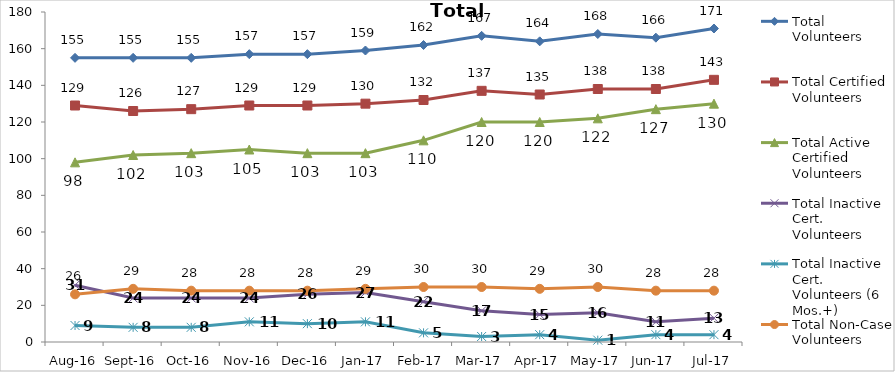
| Category | Total Volunteers | Total Certified Volunteers | Total Active Certified Volunteers | Total Inactive Cert. Volunteers | Total Inactive Cert. Volunteers (6 Mos.+) | Total Non-Case Volunteers |
|---|---|---|---|---|---|---|
| Aug-16 | 155 | 129 | 98 | 31 | 9 | 26 |
| Sep-16 | 155 | 126 | 102 | 24 | 8 | 29 |
| Oct-16 | 155 | 127 | 103 | 24 | 8 | 28 |
| Nov-16 | 157 | 129 | 105 | 24 | 11 | 28 |
| Dec-16 | 157 | 129 | 103 | 26 | 10 | 28 |
| Jan-17 | 159 | 130 | 103 | 27 | 11 | 29 |
| Feb-17 | 162 | 132 | 110 | 22 | 5 | 30 |
| Mar-17 | 167 | 137 | 120 | 17 | 3 | 30 |
| Apr-17 | 164 | 135 | 120 | 15 | 4 | 29 |
| May-17 | 168 | 138 | 122 | 16 | 1 | 30 |
| Jun-17 | 166 | 138 | 127 | 11 | 4 | 28 |
| Jul-17 | 171 | 143 | 130 | 13 | 4 | 28 |